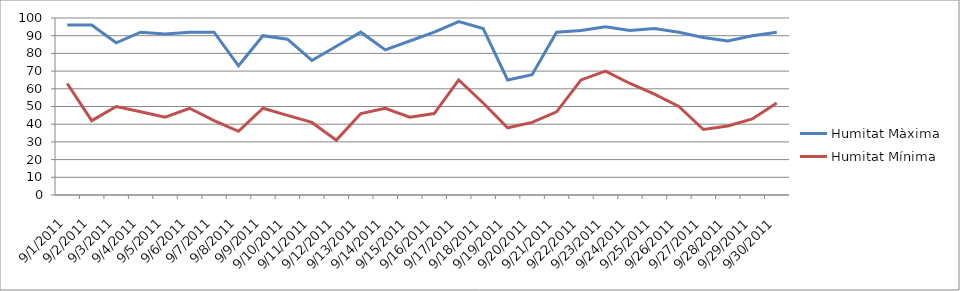
| Category | Humitat Màxima | Humitat Mínima |
|---|---|---|
| 01/09/2011 | 96 | 63 |
| 02/09/2011 | 96 | 42 |
| 03/09/2011 | 86 | 50 |
| 04/09/2011 | 92 | 47 |
| 05/09/2011 | 91 | 44 |
| 06/09/2011 | 92 | 49 |
| 07/09/2011 | 92 | 42 |
| 08/09/2011 | 73 | 36 |
| 09/09/2011 | 90 | 49 |
| 10/09/2011 | 88 | 45 |
| 11/09/2011 | 76 | 41 |
| 12/09/2011 | 84 | 31 |
| 13/09/2011 | 92 | 46 |
| 14/09/2011 | 82 | 49 |
| 15/09/2011 | 87 | 44 |
| 16/09/2011 | 92 | 46 |
| 17/09/2011 | 98 | 65 |
| 18/09/2011 | 94 | 52 |
| 19/09/2011 | 65 | 38 |
| 20/09/2011 | 68 | 41 |
| 21/09/2011 | 92 | 47 |
| 22/09/2011 | 93 | 65 |
| 23/09/2011 | 95 | 70 |
| 24/09/2011 | 93 | 63 |
| 25/09/2011 | 94 | 57 |
| 26/09/2011 | 92 | 50 |
| 27/09/2011 | 89 | 37 |
| 28/09/2011 | 87 | 39 |
| 29/09/2011 | 90 | 43 |
| 30/09/2011 | 92 | 52 |